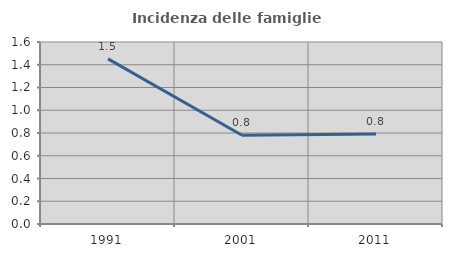
| Category | Incidenza delle famiglie numerose |
|---|---|
| 1991.0 | 1.452 |
| 2001.0 | 0.78 |
| 2011.0 | 0.792 |